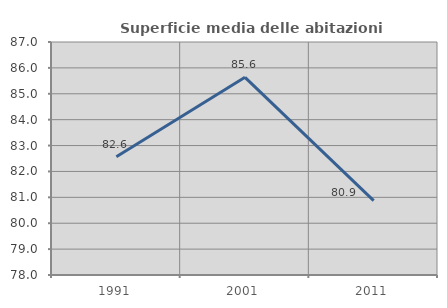
| Category | Superficie media delle abitazioni occupate |
|---|---|
| 1991.0 | 82.568 |
| 2001.0 | 85.636 |
| 2011.0 | 80.875 |